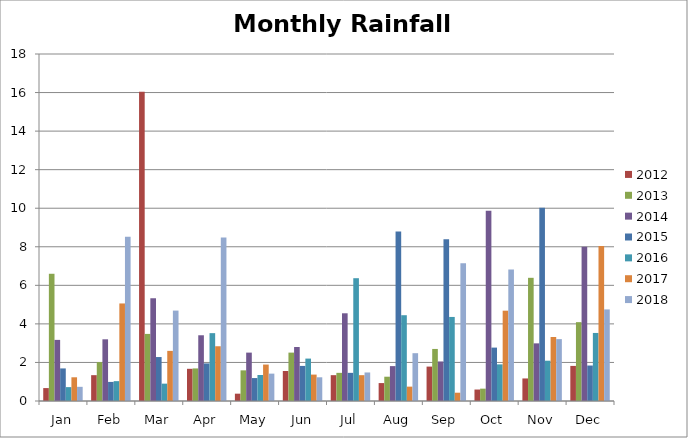
| Category | 2012 | 2013 | 2014 | 2015 | 2016 | 2017 | 2018 |
|---|---|---|---|---|---|---|---|
| Jan | 0.67 | 6.6 | 3.17 | 1.69 | 0.72 | 1.23 | 0.735 |
| Feb | 1.34 | 2.02 | 3.2 | 0.99 | 1.03 | 5.06 | 8.525 |
| Mar | 16.04 | 3.48 | 5.33 | 2.28 | 0.9 | 2.6 | 4.69 |
| Apr | 1.67 | 1.69 | 3.41 | 1.95 | 3.52 | 2.84 | 8.48 |
| May | 0.38 | 1.59 | 2.51 | 1.19 | 1.35 | 1.89 | 1.42 |
| Jun | 1.555 | 2.51 | 2.8 | 1.82 | 2.2 | 1.37 | 1.23 |
| Jul | 1.34 | 1.46 | 4.55 | 1.46 | 6.37 | 1.34 | 1.48 |
| Aug | 0.93 | 1.26 | 1.81 | 8.79 | 4.45 | 0.745 | 2.48 |
| Sep | 1.785 | 2.7 | 2.05 | 8.39 | 4.36 | 0.43 | 7.15 |
| Oct | 0.595 | 0.64 | 9.87 | 2.77 | 1.9 | 4.685 | 6.82 |
| Nov | 1.17 | 6.39 | 2.99 | 10.03 | 2.09 | 3.32 | 3.21 |
| Dec | 1.82 | 4.09 | 8 | 1.84 | 3.53 | 8.04 | 4.75 |